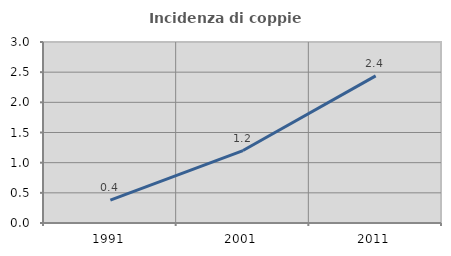
| Category | Incidenza di coppie miste |
|---|---|
| 1991.0 | 0.381 |
| 2001.0 | 1.201 |
| 2011.0 | 2.439 |